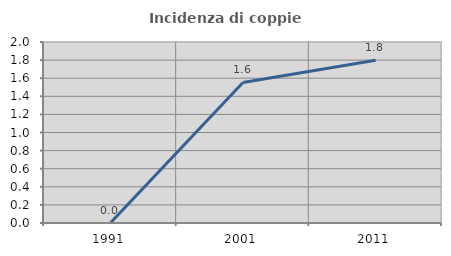
| Category | Incidenza di coppie miste |
|---|---|
| 1991.0 | 0 |
| 2001.0 | 1.553 |
| 2011.0 | 1.799 |